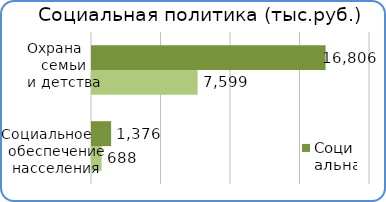
| Category | Факт | План  |
|---|---|---|
| Социальное обеспечение населения | 687600 | 1375500 |
| Охрана семьи и детства | 7599400 | 16805500 |